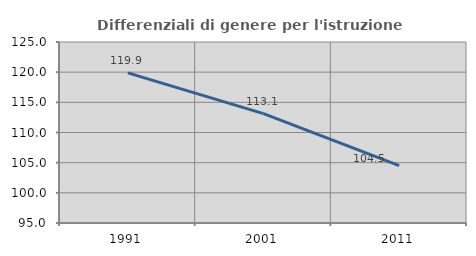
| Category | Differenziali di genere per l'istruzione superiore |
|---|---|
| 1991.0 | 119.881 |
| 2001.0 | 113.126 |
| 2011.0 | 104.523 |